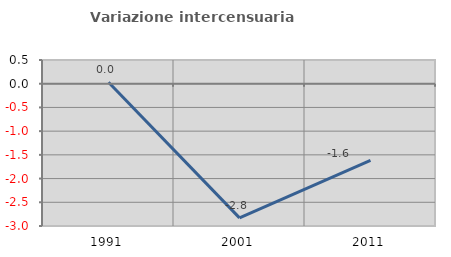
| Category | Variazione intercensuaria annua |
|---|---|
| 1991.0 | 0.03 |
| 2001.0 | -2.829 |
| 2011.0 | -1.617 |